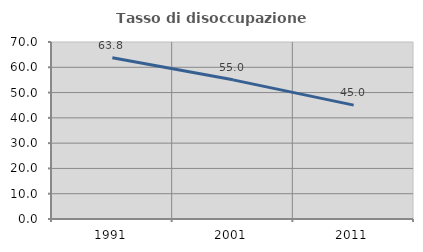
| Category | Tasso di disoccupazione giovanile  |
|---|---|
| 1991.0 | 63.808 |
| 2001.0 | 55.034 |
| 2011.0 | 45.045 |